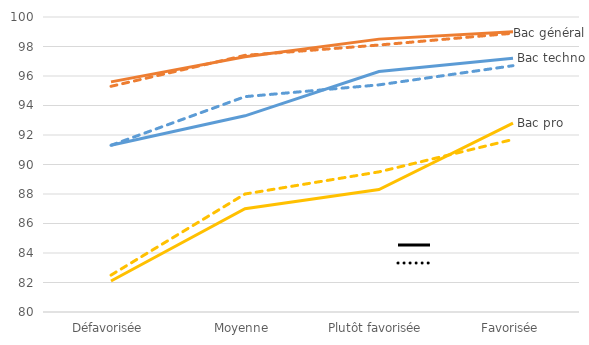
| Category | Bac général | Bac pro | Bac techno |
|---|---|---|---|
| Défavorisée | 95.3 | 82.5 | 91.3 |
| Moyenne | 97.4 | 88 | 94.6 |
| Plutôt favorisée | 98.1 | 89.5 | 95.4 |
| Favorisée | 98.9 | 91.7 | 96.7 |